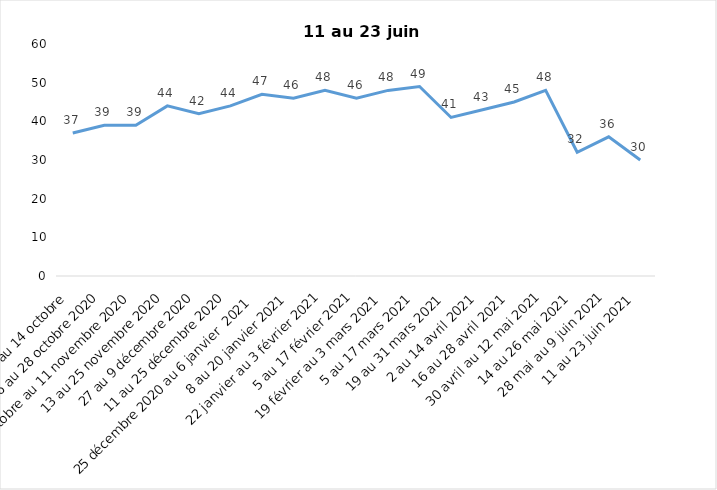
| Category | Toujours aux trois mesures |
|---|---|
| 2 au 14 octobre  | 37 |
| 16 au 28 octobre 2020 | 39 |
| 30 octobre au 11 novembre 2020 | 39 |
| 13 au 25 novembre 2020 | 44 |
| 27 au 9 décembre 2020 | 42 |
| 11 au 25 décembre 2020 | 44 |
| 25 décembre 2020 au 6 janvier  2021 | 47 |
| 8 au 20 janvier 2021 | 46 |
| 22 janvier au 3 février 2021 | 48 |
| 5 au 17 février 2021 | 46 |
| 19 février au 3 mars 2021 | 48 |
| 5 au 17 mars 2021 | 49 |
| 19 au 31 mars 2021 | 41 |
| 2 au 14 avril 2021 | 43 |
| 16 au 28 avril 2021 | 45 |
| 30 avril au 12 mai 2021 | 48 |
| 14 au 26 mai 2021 | 32 |
| 28 mai au 9 juin 2021 | 36 |
| 11 au 23 juin 2021 | 30 |